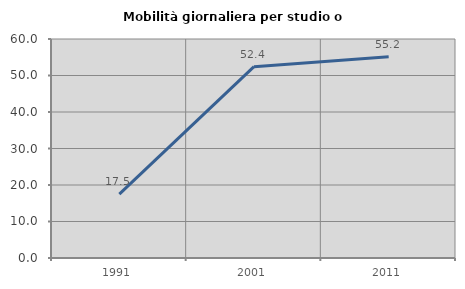
| Category | Mobilità giornaliera per studio o lavoro |
|---|---|
| 1991.0 | 17.483 |
| 2001.0 | 52.407 |
| 2011.0 | 55.154 |